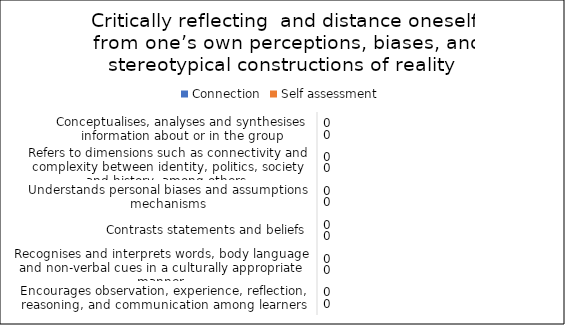
| Category | Connection | Self assessment |
|---|---|---|
| Conceptualises, analyses and synthesises information about or in the group | 0 | 0 |
| Refers to dimensions such as connectivity and complexity between identity, politics, society and history, among others  | 0 | 0 |
| Understands personal biases and assumptions mechanisms | 0 | 0 |
| Contrasts statements and beliefs | 0 | 0 |
| Recognises and interprets words, body language and non-verbal cues in a culturally appropriate manner | 0 | 0 |
| Encourages observation, experience, reflection, reasoning, and communication among learners | 0 | 0 |